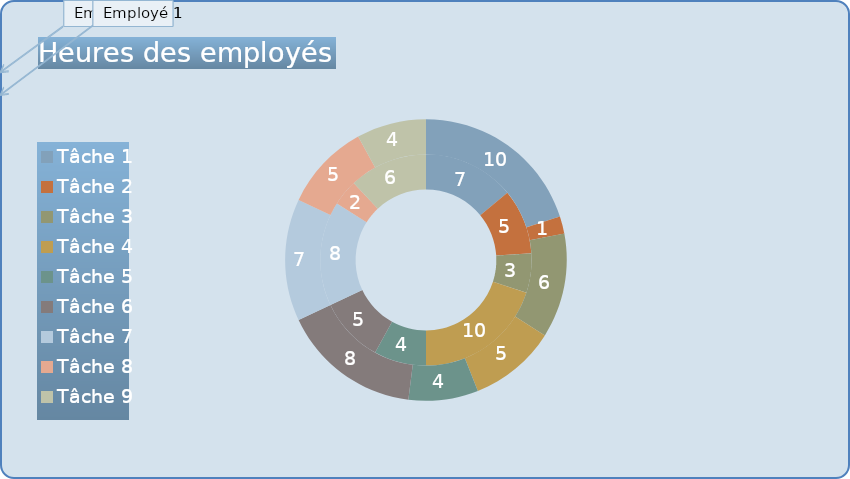
| Category | Employé 1 (h) | Employé 2 (h) |
|---|---|---|
| Tâche 1 | 7 | 10 |
| Tâche 2 | 5 | 1 |
| Tâche 3 | 3 | 6 |
| Tâche 4 | 10 | 5 |
| Tâche 5 | 4 | 4 |
| Tâche 6 | 5 | 8 |
| Tâche 7 | 8 | 7 |
| Tâche 8 | 2 | 5 |
| Tâche 9 | 6 | 4 |